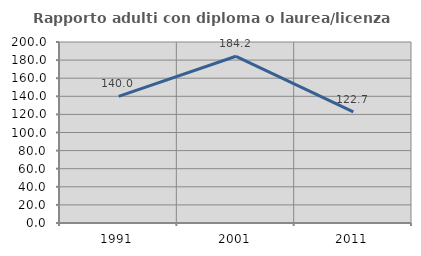
| Category | Rapporto adulti con diploma o laurea/licenza media  |
|---|---|
| 1991.0 | 140 |
| 2001.0 | 184.211 |
| 2011.0 | 122.727 |